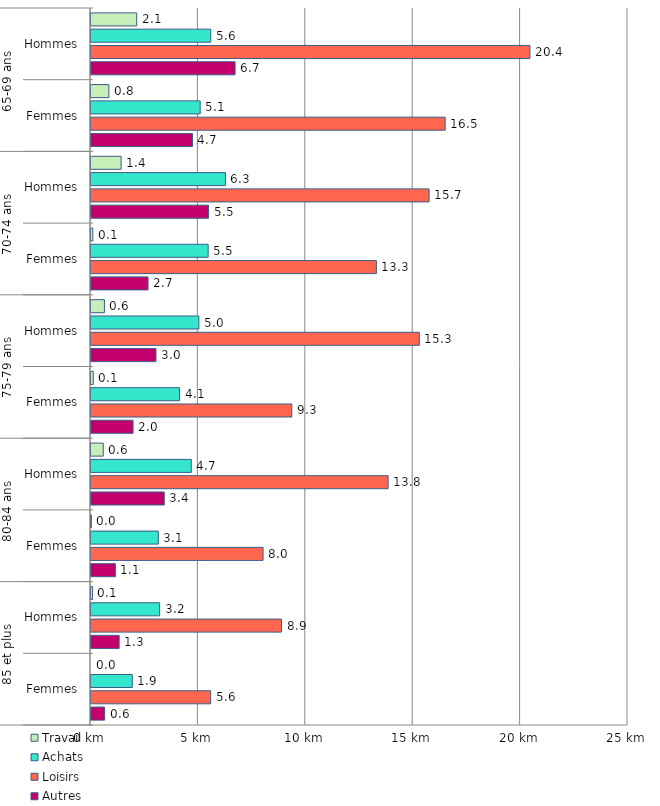
| Category | Travail | Achats | Loisirs | Autres |
|---|---|---|---|---|
| 0 | 2.126 | 5.573 | 20.436 | 6.707 |
| 1 | 0.832 | 5.083 | 16.489 | 4.725 |
| 2 | 1.402 | 6.259 | 15.741 | 5.473 |
| 3 | 0.083 | 5.454 | 13.286 | 2.656 |
| 4 | 0.625 | 5.022 | 15.285 | 3.025 |
| 5 | 0.106 | 4.121 | 9.348 | 1.959 |
| 6 | 0.571 | 4.67 | 13.833 | 3.411 |
| 7 | 0.018 | 3.132 | 8.011 | 1.134 |
| 8 | 0.066 | 3.197 | 8.869 | 1.311 |
| 9 | 0 | 1.923 | 5.571 | 0.636 |